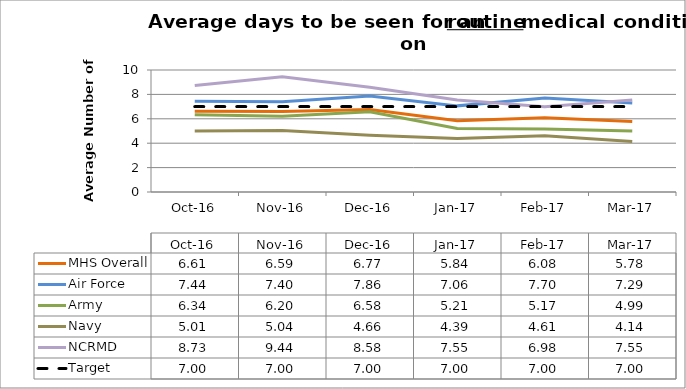
| Category | MHS Overall | Air Force | Army | Navy | NCRMD | Target |
|---|---|---|---|---|---|---|
| 2016-10-01 | 6.61 | 7.44 | 6.34 | 5.01 | 8.73 | 7 |
| 2016-11-01 | 6.59 | 7.4 | 6.2 | 5.04 | 9.44 | 7 |
| 2016-12-01 | 6.77 | 7.86 | 6.58 | 4.66 | 8.58 | 7 |
| 2017-01-01 | 5.84 | 7.06 | 5.21 | 4.39 | 7.55 | 7 |
| 2017-02-01 | 6.08 | 7.7 | 5.17 | 4.61 | 6.98 | 7 |
| 2017-03-01 | 5.78 | 7.29 | 4.99 | 4.14 | 7.55 | 7 |